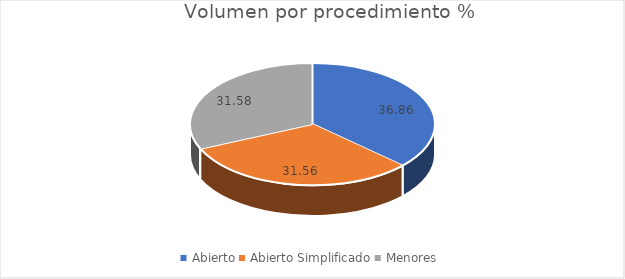
| Category | Series 0 |
|---|---|
| Abierto | 36.859 |
| Abierto Simplificado | 31.561 |
| Menores | 31.58 |